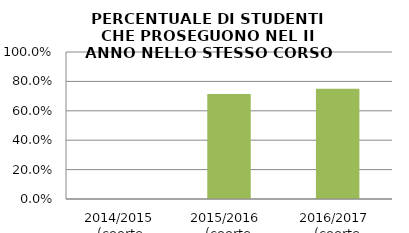
| Category | 2014/2015 (coorte 2013/14) 2015/2016  (coorte 2014/15) 2016/2017  (coorte 2015/16) |
|---|---|
| 2014/2015 (coorte 2013/14) | 0 |
| 2015/2016  (coorte 2014/15) | 0.714 |
| 2016/2017  (coorte 2015/16) | 0.75 |